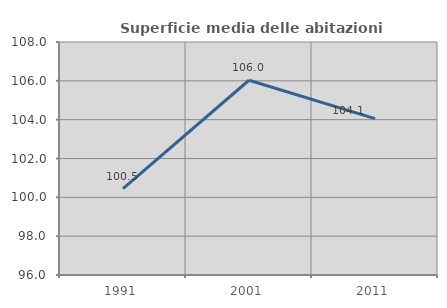
| Category | Superficie media delle abitazioni occupate |
|---|---|
| 1991.0 | 100.451 |
| 2001.0 | 106.03 |
| 2011.0 | 104.053 |